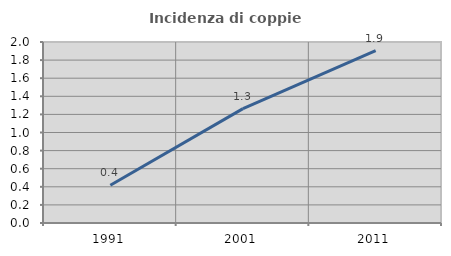
| Category | Incidenza di coppie miste |
|---|---|
| 1991.0 | 0.418 |
| 2001.0 | 1.263 |
| 2011.0 | 1.904 |